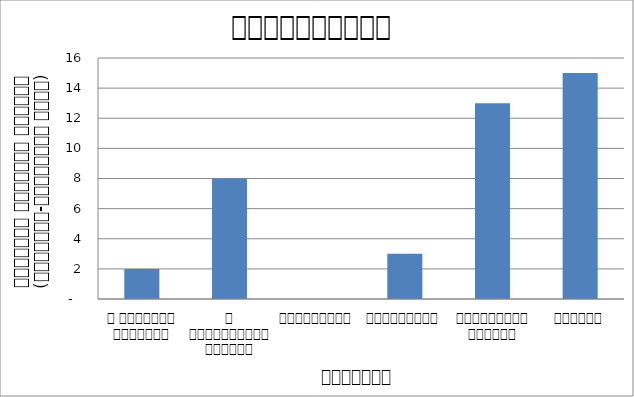
| Category | अर्थतन्त्र |
|---|---|
| द हिमालयन टाइम्स् | 2 |
| द काठमाण्डौं पोस्ट् | 8 |
| रिपब्लिका | 0 |
| कान्तिपुर | 3 |
| अन्नपूर्ण पोस्ट् | 13 |
| नागरिक | 15 |